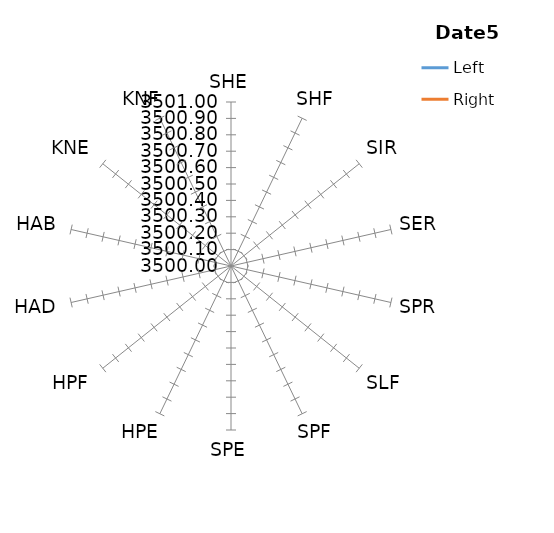
| Category | Left | Right |
|---|---|---|
| SHE | 55.88 | 56.45 |
| SHF | 53.91 | 56.69 |
| SIR | 51.7 | 51.9 |
| SER | 58.89 | 58.43 |
| SPR | 57.35 | 54.31 |
| SLF | 51.42 | 58.19 |
| SPF | 45.61 | 55.69 |
| SPE | 56.19 | 58.38 |
| HPE | 53.22 | 56.56 |
| HPF | 58.23 | 53.43 |
| HAD | 51.26 | 48.65 |
| HAB | 57.67 | 54.81 |
| KNE | 51.12 | 45.28 |
| KNF | 59.06 | 56.52 |